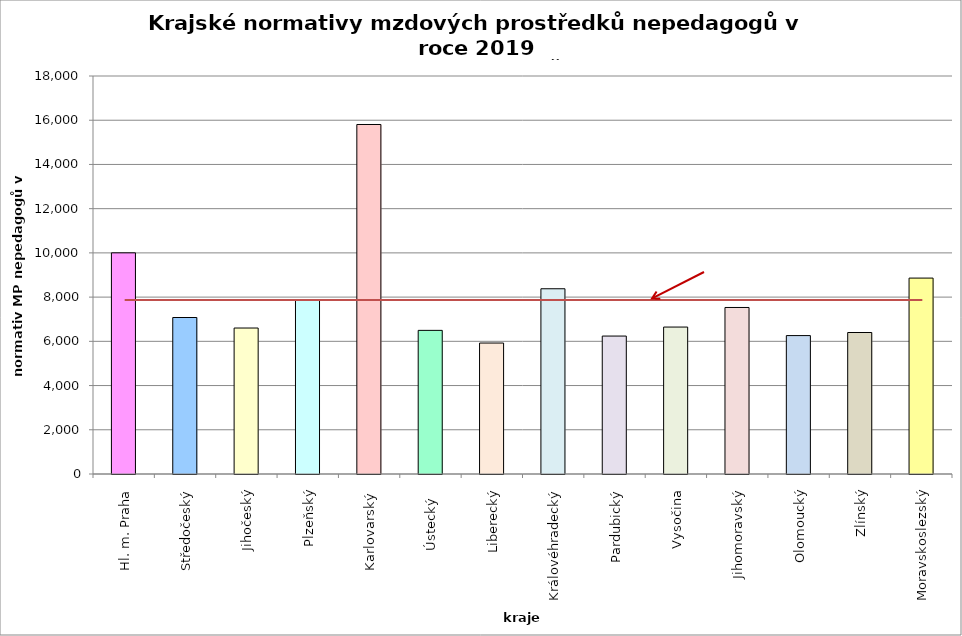
| Category | Series 0 |
|---|---|
| Hl. m. Praha | 10002.286 |
| Středočeský | 7077.522 |
| Jihočeský | 6601.722 |
| Plzeňský | 7882.5 |
| Karlovarský  | 15806.897 |
| Ústecký   | 6495.652 |
| Liberecký | 5923.061 |
| Královéhradecký | 8377.465 |
| Pardubický | 6238.655 |
| Vysočina | 6645.654 |
| Jihomoravský | 7531.309 |
| Olomoucký | 6259.92 |
| Zlínský | 6399.191 |
| Moravskoslezský | 8860.439 |